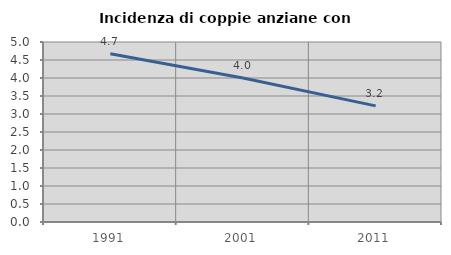
| Category | Incidenza di coppie anziane con figli |
|---|---|
| 1991.0 | 4.673 |
| 2001.0 | 4 |
| 2011.0 | 3.226 |